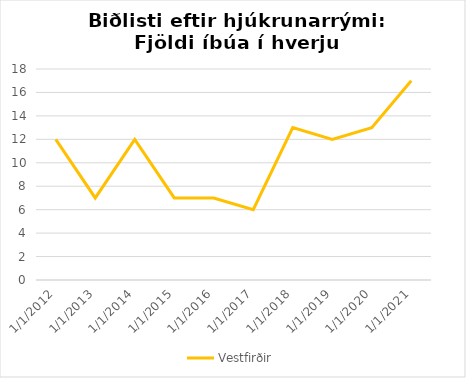
| Category | Vestfirðir |
|---|---|
| 1/1/12 | 12 |
| 1/1/13 | 7 |
| 1/1/14 | 12 |
| 1/1/15 | 7 |
| 1/1/16 | 7 |
| 1/1/17 | 6 |
| 1/1/18 | 13 |
| 1/1/19 | 12 |
| 1/1/20 | 13 |
| 1/1/21 | 17 |